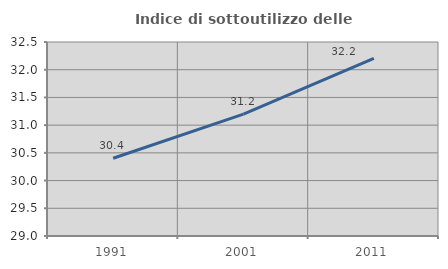
| Category | Indice di sottoutilizzo delle abitazioni  |
|---|---|
| 1991.0 | 30.403 |
| 2001.0 | 31.198 |
| 2011.0 | 32.203 |